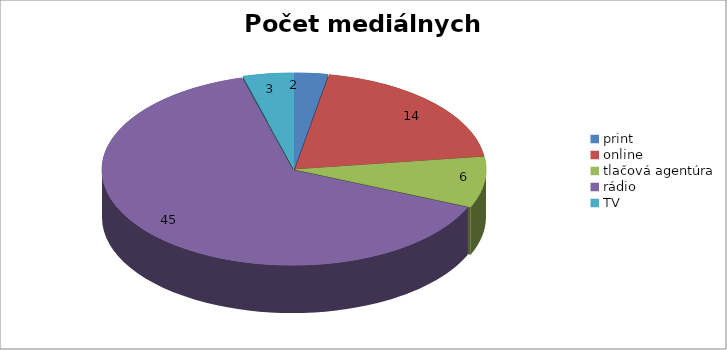
| Category | Počet mediálnych výstupov |
|---|---|
| print | 2 |
| online | 14 |
| tlačová agentúra | 6 |
| rádio | 45 |
| TV | 3 |